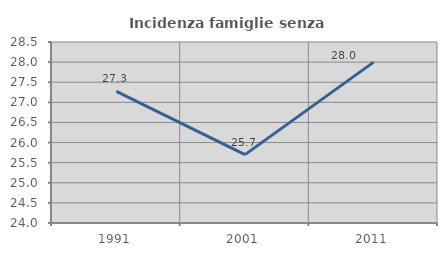
| Category | Incidenza famiglie senza nuclei |
|---|---|
| 1991.0 | 27.273 |
| 2001.0 | 25.699 |
| 2011.0 | 28 |